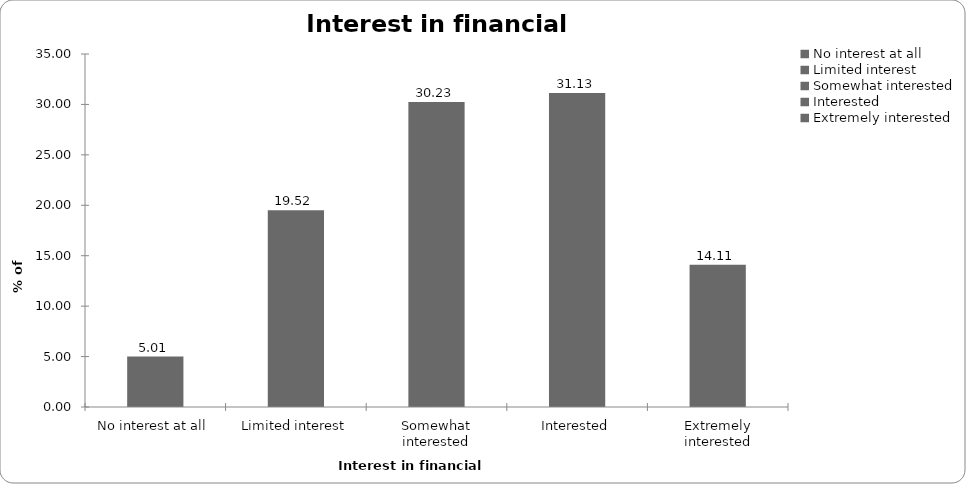
| Category | Interest in financial planning |
|---|---|
| No interest at all | 5.005 |
| Limited interest | 19.52 |
| Somewhat interested | 30.23 |
| Interested | 31.131 |
| Extremely interested | 14.114 |